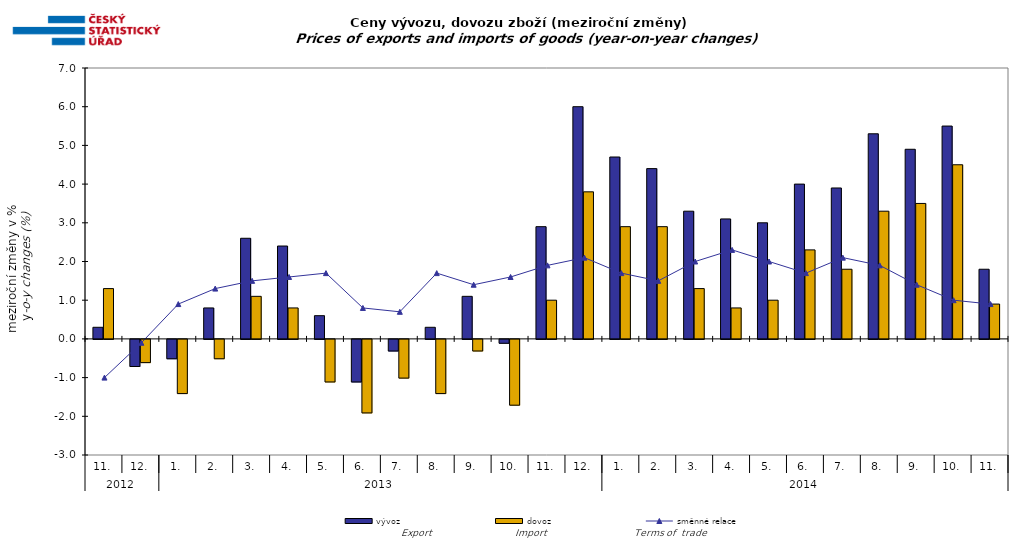
| Category | vývoz | dovoz |
|---|---|---|
| 0 | 0.3 | 1.3 |
| 1 | -0.7 | -0.6 |
| 2 | -0.5 | -1.4 |
| 3 | 0.8 | -0.5 |
| 4 | 2.6 | 1.1 |
| 5 | 2.4 | 0.8 |
| 6 | 0.6 | -1.1 |
| 7 | -1.1 | -1.9 |
| 8 | -0.3 | -1 |
| 9 | 0.3 | -1.4 |
| 10 | 1.1 | -0.3 |
| 11 | -0.1 | -1.7 |
| 12 | 2.9 | 1 |
| 13 | 6 | 3.8 |
| 14 | 4.7 | 2.9 |
| 15 | 4.4 | 2.9 |
| 16 | 3.3 | 1.3 |
| 17 | 3.1 | 0.8 |
| 18 | 3 | 1 |
| 19 | 4 | 2.3 |
| 20 | 3.9 | 1.8 |
| 21 | 5.3 | 3.3 |
| 22 | 4.9 | 3.5 |
| 23 | 5.5 | 4.5 |
| 24 | 1.8 | 0.9 |